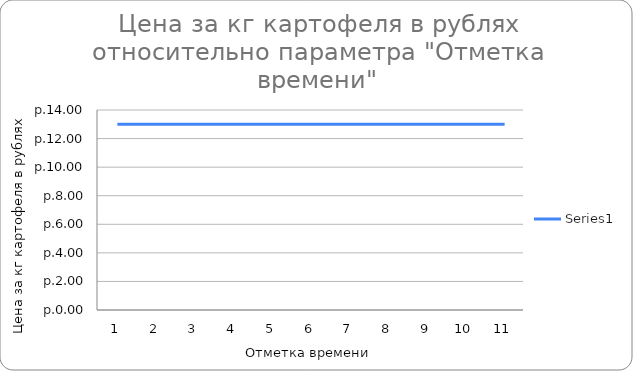
| Category | Series 0 |
|---|---|
| 0 | 13 |
| 1/1/00 | 13 |
| 1/2/00 | 13 |
| 1/3/00 | 13 |
| 1/4/00 | 13 |
| 1/5/00 | 13 |
| 1/6/00 | 13 |
| 1/7/00 | 13 |
| 1/8/00 | 13 |
| 1/9/00 | 13 |
| 1/10/00 | 13 |